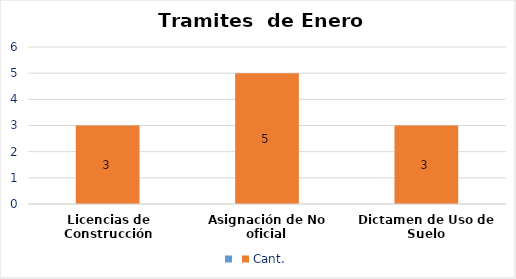
| Category | Series 0 | Cant. |
|---|---|---|
| Licencias de Construcción |  | 3 |
| Asignación de No oficial |  | 5 |
| Dictamen de Uso de Suelo |  | 3 |